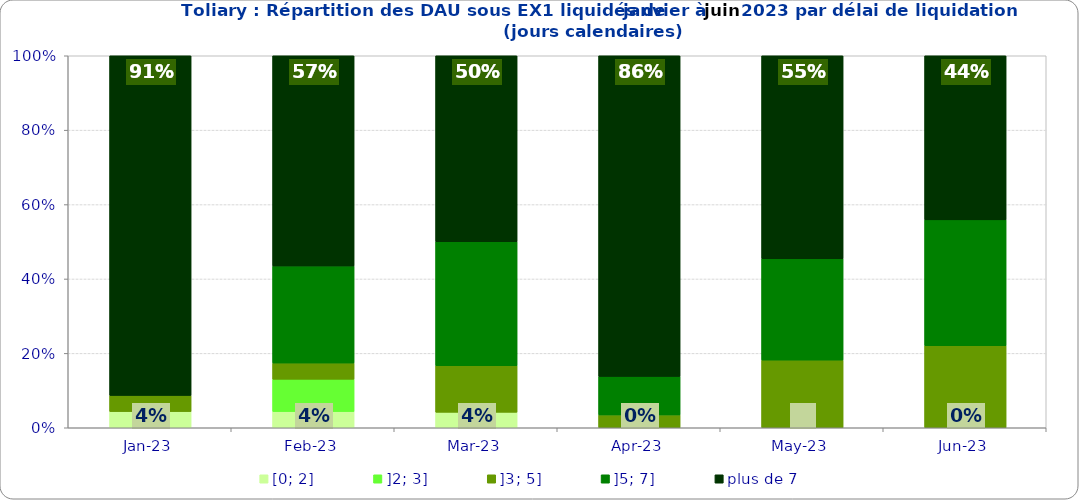
| Category | [0; 2] | ]2; 3] | ]3; 5] | ]5; 7] | plus de 7 |
|---|---|---|---|---|---|
| 2023-01-01 | 0.043 | 0 | 0.043 | 0 | 0.913 |
| 2023-02-01 | 0.043 | 0.087 | 0.043 | 0.261 | 0.565 |
| 2023-03-01 | 0.042 | 0 | 0.125 | 0.333 | 0.5 |
| 2023-04-01 | 0 | 0 | 0.034 | 0.103 | 0.862 |
| 2023-05-01 | 0 | 0 | 0.182 | 0.273 | 0.545 |
| 2023-06-01 | 0 | 0 | 0.221 | 0.338 | 0.441 |